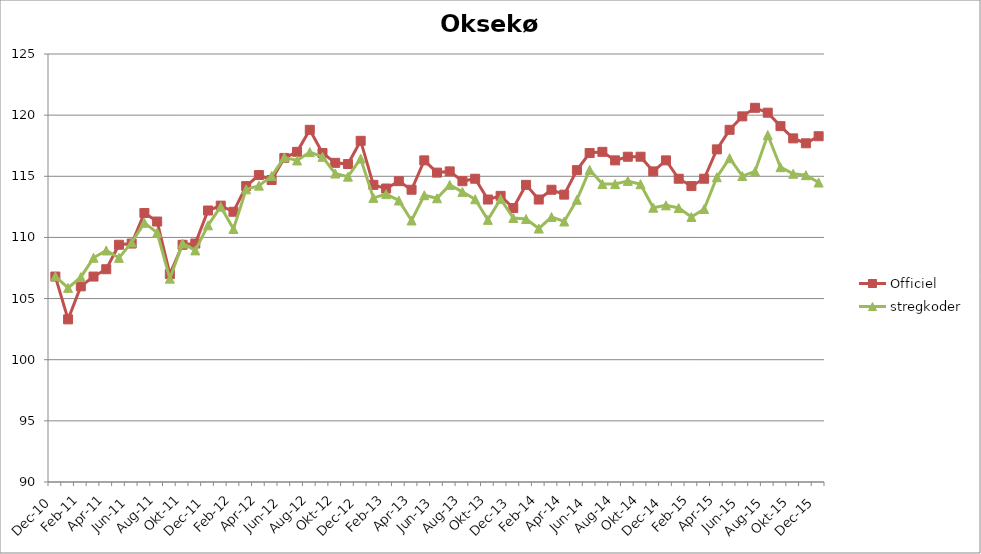
| Category | Officiel | stregkoder |
|---|---|---|
|  Dec-10 | 106.8 | 106.821 |
|  Jan-11 | 103.3 | 105.874 |
|  Feb-11 | 106 | 106.752 |
|  Mar-11 | 106.8 | 108.333 |
|  Apr-11 | 107.4 | 108.933 |
|  Maj-11 | 109.4 | 108.33 |
|  Jun-11 | 109.5 | 109.592 |
|  Jul-11 | 112 | 111.195 |
|  Aug-11 | 111.3 | 110.391 |
|  Sep-11 | 107 | 106.629 |
|  Okt-11 | 109.4 | 109.503 |
|  Nov-11 | 109.5 | 108.941 |
|  Dec-11 | 112.2 | 110.991 |
|  Jan-12 | 112.6 | 112.514 |
|  Feb-12 | 112.1 | 110.691 |
|  Mar-12 | 114.2 | 113.931 |
|  Apr-12 | 115.1 | 114.235 |
|  Maj-12 | 114.7 | 115.017 |
|  Jun-12 | 116.5 | 116.544 |
|  Jul-12 | 117 | 116.294 |
|  Aug-12 | 118.8 | 116.975 |
|  Sep-12 | 116.9 | 116.591 |
|  Okt-12 | 116.1 | 115.223 |
|  Nov-12 | 116 | 114.972 |
|  Dec-12 | 117.9 | 116.445 |
|  Jan-13 | 114.3 | 113.234 |
|  Feb-13 | 114 | 113.542 |
|  Mar-13 | 114.6 | 113.018 |
|  Apr-13 | 113.9 | 111.387 |
|  Maj-13 | 116.3 | 113.451 |
|  Jun-13 | 115.3 | 113.201 |
|  Jul-13 | 115.4 | 114.294 |
|  Aug-13 | 114.6 | 113.723 |
|  Sep-13 | 114.8 | 113.12 |
|  Okt-13 | 113.1 | 111.436 |
|  Nov-13 | 113.4 | 113.142 |
|  Dec-13 | 112.4 | 111.592 |
|  Jan-14 | 114.3 | 111.503 |
|  Feb-14 | 113.1 | 110.724 |
|  Mar-14 | 113.9 | 111.669 |
|  Apr-14 | 113.5 | 111.302 |
|  Maj-14 | 115.5 | 113.081 |
|  Jun-14 | 116.9 | 115.527 |
|  Jul-14 | 117 | 114.364 |
|  Aug-14 | 116.3 | 114.364 |
|  Sep-14 | 116.6 | 114.621 |
|  Okt-14 | 116.6 | 114.352 |
|  Nov-14 | 115.4 | 112.428 |
|  Dec-14 | 116.3 | 112.623 |
|  Jan-15 | 114.8 | 112.407 |
|  Feb-15 | 114.2 | 111.67 |
|  Mar-15 | 114.8 | 112.325 |
|  Apr-15 | 117.2 | 114.924 |
|  Maj-15 | 118.8 | 116.48 |
| Jun-15 | 119.9 | 115.019 |
| Jul-15 | 120.6 | 115.4 |
| Aug-15 | 120.2 | 118.373 |
| Sep-15 | 119.1 | 115.744 |
| Okt-15 | 118.1 | 115.204 |
| Nov-15 | 117.7 | 115.089 |
| Dec-15 | 118.276 | 114.489 |